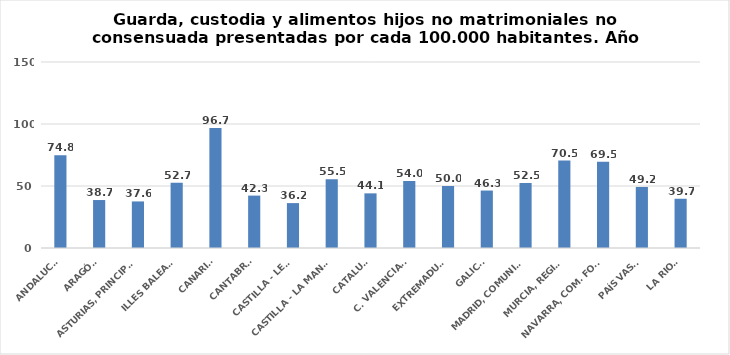
| Category | Series 0 |
|---|---|
| ANDALUCÍA | 74.807 |
| ARAGÓN | 38.68 |
| ASTURIAS, PRINCIPADO | 37.557 |
| ILLES BALEARS | 52.685 |
| CANARIAS | 96.689 |
| CANTABRIA | 42.258 |
| CASTILLA - LEÓN | 36.213 |
| CASTILLA - LA MANCHA | 55.524 |
| CATALUÑA | 44.066 |
| C. VALENCIANA | 53.972 |
| EXTREMADURA | 50.024 |
| GALICIA | 46.334 |
| MADRID, COMUNIDAD | 52.509 |
| MURCIA, REGIÓN | 70.531 |
| NAVARRA, COM. FORAL | 69.535 |
| PAÍS VASCO | 49.232 |
| LA RIOJA | 39.713 |